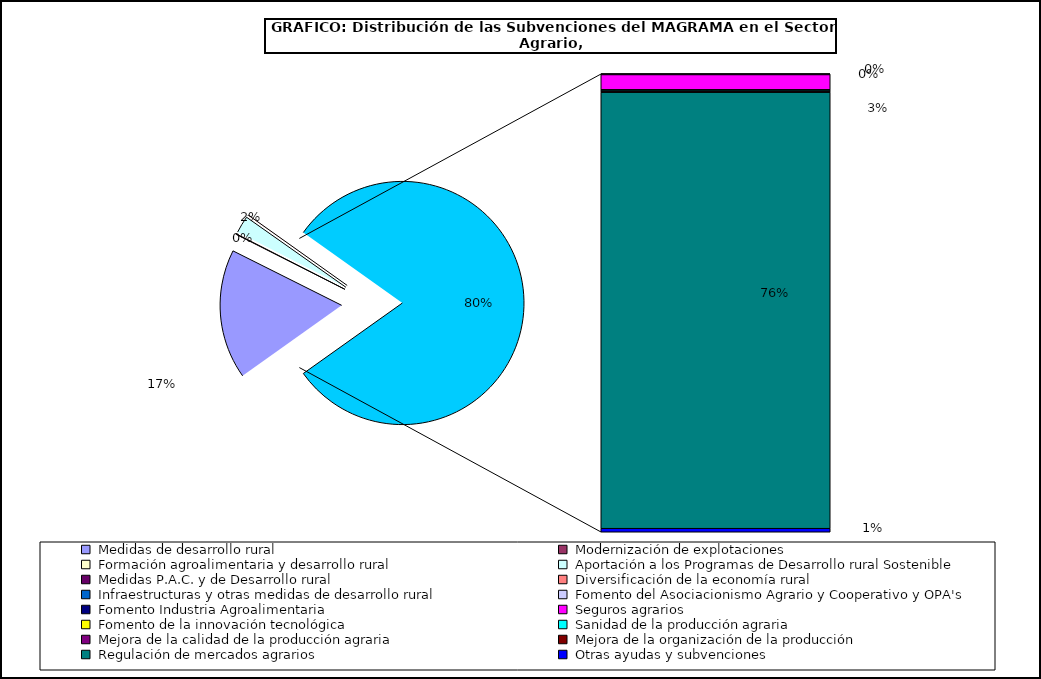
| Category | Series 0 |
|---|---|
|  Medidas de desarrollo rural | 1290240 |
|  Modernización de explotaciones | 4521.9 |
|  Formación agroalimentaria y desarrollo rural | 3723.2 |
|  Aportación a los Programas de Desarrollo rural Sostenible | 169908.3 |
|  Medidas P.A.C. y de Desarrollo rural | 0 |
|  Diversificación de la economía rural | 5221.5 |
|  Infraestructuras y otras medidas de desarrollo rural | 50 |
|  Fomento del Asociacionismo Agrario y Cooperativo y OPA's | 4390.2 |
|  Fomento Industria Agroalimentaria  | 5408.9 |
|  Seguros agrarios | 199186.1 |
|  Fomento de la innovación tecnológica  | 200 |
|  Sanidad de la producción agraria | 13001 |
|  Mejora de la calidad de la producción agraria | 11597.3 |
|  Mejora de la organización de la producción | 7870.1 |
|  Regulación de mercados agrarios | 5724968.9 |
|  Otras ayudas y subvenciones | 46186 |